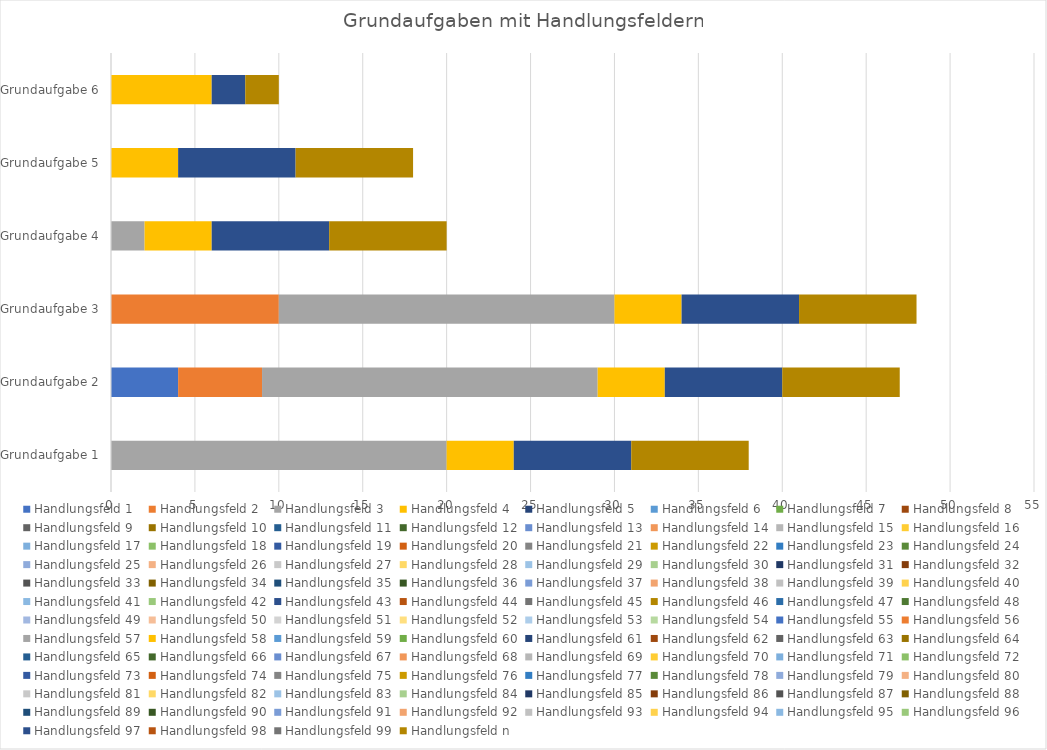
| Category | Handlungsfeld 1 | Handlungsfeld 2 | Handlungsfeld 3 | Handlungsfeld 4 | Handlungsfeld 5 | Handlungsfeld 6 | Handlungsfeld 7 | Handlungsfeld 8 | Handlungsfeld 9 | Handlungsfeld 10 | Handlungsfeld 11 | Handlungsfeld 12 | Handlungsfeld 13 | Handlungsfeld 14 | Handlungsfeld 15 | Handlungsfeld 16 | Handlungsfeld 17 | Handlungsfeld 18 | Handlungsfeld 19 | Handlungsfeld 20 | Handlungsfeld 21 | Handlungsfeld 22 | Handlungsfeld 23 | Handlungsfeld 24 | Handlungsfeld 25 | Handlungsfeld 26 | Handlungsfeld 27 | Handlungsfeld 28 | Handlungsfeld 29 | Handlungsfeld 30 | Handlungsfeld 31 | Handlungsfeld 32 | Handlungsfeld 33 | Handlungsfeld 34 | Handlungsfeld 35 | Handlungsfeld 36 | Handlungsfeld 37 | Handlungsfeld 38 | Handlungsfeld 39 | Handlungsfeld 40 | Handlungsfeld 41 | Handlungsfeld 42 | Handlungsfeld 43 | Handlungsfeld 44 | Handlungsfeld 45 | Handlungsfeld 46 | Handlungsfeld 47 | Handlungsfeld 48 | Handlungsfeld 49 | Handlungsfeld 50 | Handlungsfeld 51 | Handlungsfeld 52 | Handlungsfeld 53 | Handlungsfeld 54 | Handlungsfeld 55 | Handlungsfeld 56 | Handlungsfeld 57 | Handlungsfeld 58 | Handlungsfeld 59 | Handlungsfeld 60 | Handlungsfeld 61 | Handlungsfeld 62 | Handlungsfeld 63 | Handlungsfeld 64 | Handlungsfeld 65 | Handlungsfeld 66 | Handlungsfeld 67 | Handlungsfeld 68 | Handlungsfeld 69 | Handlungsfeld 70 | Handlungsfeld 71 | Handlungsfeld 72 | Handlungsfeld 73 | Handlungsfeld 74 | Handlungsfeld 75 | Handlungsfeld 76 | Handlungsfeld 77 | Handlungsfeld 78 | Handlungsfeld 79 | Handlungsfeld 80 | Handlungsfeld 81 | Handlungsfeld 82 | Handlungsfeld 83 | Handlungsfeld 84 | Handlungsfeld 85 | Handlungsfeld 86 | Handlungsfeld 87 | Handlungsfeld 88 | Handlungsfeld 89 | Handlungsfeld 90 | Handlungsfeld 91 | Handlungsfeld 92 | Handlungsfeld 93 | Handlungsfeld 94 | Handlungsfeld 95 | Handlungsfeld 96 | Handlungsfeld 97 | Handlungsfeld 98 | Handlungsfeld 99 | Handlungsfeld n |
|---|---|---|---|---|---|---|---|---|---|---|---|---|---|---|---|---|---|---|---|---|---|---|---|---|---|---|---|---|---|---|---|---|---|---|---|---|---|---|---|---|---|---|---|---|---|---|---|---|---|---|---|---|---|---|---|---|---|---|---|---|---|---|---|---|---|---|---|---|---|---|---|---|---|---|---|---|---|---|---|---|---|---|---|---|---|---|---|---|---|---|---|---|---|---|---|---|---|---|---|---|
| Grundaufgabe 1 | 0 | 0 | 20 | 4 | 0 | 0 | 0 | 0 | 0 | 0 | 0 | 0 | 0 | 0 | 0 | 0 | 0 | 0 | 0 | 0 | 0 | 0 | 0 | 0 | 0 | 0 | 0 | 0 | 0 | 0 | 0 | 0 | 0 | 0 | 0 | 0 | 0 | 0 | 0 | 0 | 0 | 0 | 0 | 0 | 0 | 0 | 0 | 0 | 0 | 0 | 0 | 0 | 0 | 0 | 0 | 0 | 0 | 0 | 0 | 0 | 0 | 0 | 0 | 0 | 0 | 0 | 0 | 0 | 0 | 0 | 0 | 0 | 0 | 0 | 0 | 0 | 0 | 0 | 0 | 0 | 0 | 0 | 0 | 0 | 0 | 0 | 0 | 0 | 0 | 0 | 0 | 0 | 0 | 0 | 0 | 0 | 7 | 0 | 0 | 7 |
| Grundaufgabe 2 | 4 | 5 | 20 | 4 | 0 | 0 | 0 | 0 | 0 | 0 | 0 | 0 | 0 | 0 | 0 | 0 | 0 | 0 | 0 | 0 | 0 | 0 | 0 | 0 | 0 | 0 | 0 | 0 | 0 | 0 | 0 | 0 | 0 | 0 | 0 | 0 | 0 | 0 | 0 | 0 | 0 | 0 | 0 | 0 | 0 | 0 | 0 | 0 | 0 | 0 | 0 | 0 | 0 | 0 | 0 | 0 | 0 | 0 | 0 | 0 | 0 | 0 | 0 | 0 | 0 | 0 | 0 | 0 | 0 | 0 | 0 | 0 | 0 | 0 | 0 | 0 | 0 | 0 | 0 | 0 | 0 | 0 | 0 | 0 | 0 | 0 | 0 | 0 | 0 | 0 | 0 | 0 | 0 | 0 | 0 | 0 | 7 | 0 | 0 | 7 |
| Grundaufgabe 3 | 0 | 10 | 20 | 4 | 0 | 0 | 0 | 0 | 0 | 0 | 0 | 0 | 0 | 0 | 0 | 0 | 0 | 0 | 0 | 0 | 0 | 0 | 0 | 0 | 0 | 0 | 0 | 0 | 0 | 0 | 0 | 0 | 0 | 0 | 0 | 0 | 0 | 0 | 0 | 0 | 0 | 0 | 0 | 0 | 0 | 0 | 0 | 0 | 0 | 0 | 0 | 0 | 0 | 0 | 0 | 0 | 0 | 0 | 0 | 0 | 0 | 0 | 0 | 0 | 0 | 0 | 0 | 0 | 0 | 0 | 0 | 0 | 0 | 0 | 0 | 0 | 0 | 0 | 0 | 0 | 0 | 0 | 0 | 0 | 0 | 0 | 0 | 0 | 0 | 0 | 0 | 0 | 0 | 0 | 0 | 0 | 7 | 0 | 0 | 7 |
| Grundaufgabe 4 | 0 | 0 | 2 | 4 | 0 | 0 | 0 | 0 | 0 | 0 | 0 | 0 | 0 | 0 | 0 | 0 | 0 | 0 | 0 | 0 | 0 | 0 | 0 | 0 | 0 | 0 | 0 | 0 | 0 | 0 | 0 | 0 | 0 | 0 | 0 | 0 | 0 | 0 | 0 | 0 | 0 | 0 | 0 | 0 | 0 | 0 | 0 | 0 | 0 | 0 | 0 | 0 | 0 | 0 | 0 | 0 | 0 | 0 | 0 | 0 | 0 | 0 | 0 | 0 | 0 | 0 | 0 | 0 | 0 | 0 | 0 | 0 | 0 | 0 | 0 | 0 | 0 | 0 | 0 | 0 | 0 | 0 | 0 | 0 | 0 | 0 | 0 | 0 | 0 | 0 | 0 | 0 | 0 | 0 | 0 | 0 | 7 | 0 | 0 | 7 |
| Grundaufgabe 5 | 0 | 0 | 0 | 4 | 0 | 0 | 0 | 0 | 0 | 0 | 0 | 0 | 0 | 0 | 0 | 0 | 0 | 0 | 0 | 0 | 0 | 0 | 0 | 0 | 0 | 0 | 0 | 0 | 0 | 0 | 0 | 0 | 0 | 0 | 0 | 0 | 0 | 0 | 0 | 0 | 0 | 0 | 0 | 0 | 0 | 0 | 0 | 0 | 0 | 0 | 0 | 0 | 0 | 0 | 0 | 0 | 0 | 0 | 0 | 0 | 0 | 0 | 0 | 0 | 0 | 0 | 0 | 0 | 0 | 0 | 0 | 0 | 0 | 0 | 0 | 0 | 0 | 0 | 0 | 0 | 0 | 0 | 0 | 0 | 0 | 0 | 0 | 0 | 0 | 0 | 0 | 0 | 0 | 0 | 0 | 0 | 7 | 0 | 0 | 7 |
| Grundaufgabe 6 | 0 | 0 | 0 | 6 | 0 | 0 | 0 | 0 | 0 | 0 | 0 | 0 | 0 | 0 | 0 | 0 | 0 | 0 | 0 | 0 | 0 | 0 | 0 | 0 | 0 | 0 | 0 | 0 | 0 | 0 | 0 | 0 | 0 | 0 | 0 | 0 | 0 | 0 | 0 | 0 | 0 | 0 | 0 | 0 | 0 | 0 | 0 | 0 | 0 | 0 | 0 | 0 | 0 | 0 | 0 | 0 | 0 | 0 | 0 | 0 | 0 | 0 | 0 | 0 | 0 | 0 | 0 | 0 | 0 | 0 | 0 | 0 | 0 | 0 | 0 | 0 | 0 | 0 | 0 | 0 | 0 | 0 | 0 | 0 | 0 | 0 | 0 | 0 | 0 | 0 | 0 | 0 | 0 | 0 | 0 | 0 | 2 | 0 | 0 | 2 |